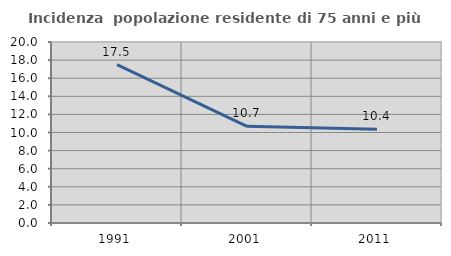
| Category | Incidenza  popolazione residente di 75 anni e più |
|---|---|
| 1991.0 | 17.5 |
| 2001.0 | 10.681 |
| 2011.0 | 10.363 |